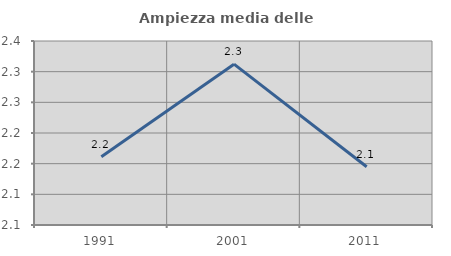
| Category | Ampiezza media delle famiglie |
|---|---|
| 1991.0 | 2.161 |
| 2001.0 | 2.312 |
| 2011.0 | 2.145 |